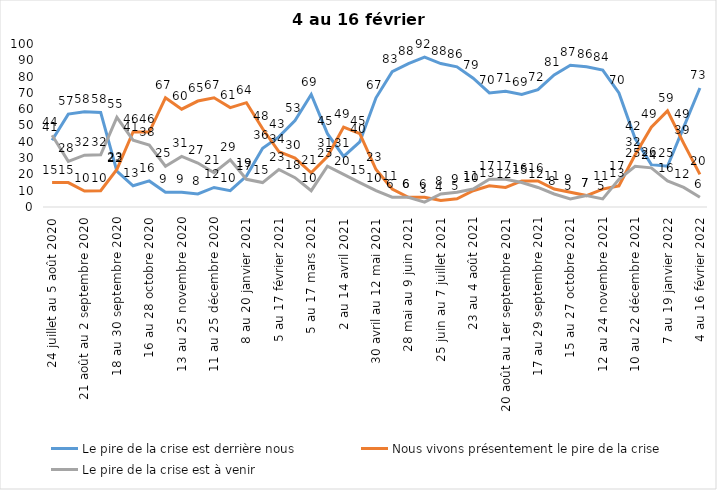
| Category | Le pire de la crise est derrière nous | Nous vivons présentement le pire de la crise | Le pire de la crise est à venir |
|---|---|---|---|
| 24 juillet au 5 août 2020 | 41 | 15 | 44 |
| 7 au 19 août 2020 | 57 | 15 | 28 |
| 21 août au 2 septembre 2020 | 58.39 | 9.84 | 31.77 |
| 4 au 16 septembre 2020 | 58 | 10 | 32 |
| 18 au 30 septembre 2020 | 22 | 23 | 55 |
| 2 au 14 octobre 2020 | 13 | 46 | 41 |
| 16 au 28 octobre 2020 | 16 | 46 | 38 |
| 30 octobre au 11 novembre 2020 | 9 | 67 | 25 |
| 13 au 25 novembre 2020 | 9 | 60 | 31 |
| 27 novembre au 9 décembre 2020 | 8 | 65 | 27 |
| 11 au 25 décembre 2020 | 12 | 67 | 21 |
| 25 décembre 2020 au 6 janvier 2021 | 10 | 61 | 29 |
| 8 au 20 janvier 2021 | 19 | 64 | 17 |
| 22 janvier au 3 février 2021 | 36 | 48 | 15 |
| 5 au 17 février 2021 | 43 | 34 | 23 |
| 19 février au 3 mars 2021 | 53 | 30 | 18 |
| 5 au 17 mars 2021 | 69 | 21 | 10 |
| 19 au 31 mars 2021 | 45 | 31 | 25 |
| 2 au 14 avril 2021 | 31 | 49 | 20 |
| 16 au 28 avril 2021 | 40 | 45 | 15 |
| 30 avril au 12 mai 2021 | 67 | 23 | 10 |
| 14 au 26 mai 2021 | 83 | 11 | 6 |
| 28 mai au 9 juin 2021 | 88 | 6 | 6 |
| 11 au 23 juin 2021 | 92 | 6 | 3 |
| 25 juin au 7 juillet 2021 | 88 | 4 | 8 |
| 9 au 21 juillet 2021 | 86 | 5 | 9 |
| 23 au 4 août 2021 | 79 | 10 | 11 |
| 6 au 18 août 2021 | 70 | 13 | 17 |
| 20 août au 1er septembre 2021 | 71 | 12 | 17 |
| 3 au 15 septembre 2021 | 69 | 16 | 15 |
| 17 au 29 septembre 2021 | 72 | 16 | 12 |
| 1 au 13 octobre 2021 | 81 | 11 | 8 |
| 15 au 27 octobre 2021 | 87 | 9 | 5 |
| 29 octobre au 10 novembre 2021 | 86 | 7 | 7 |
| 12 au 24 novembre 2021 | 84 | 11 | 5 |
| 26 novembre au 8 décembre 2021 | 70 | 13 | 17 |
| 10 au 22 décembre 2021 | 42 | 32 | 25 |
| 24 décembre 2021 au 5 janvier 2022 | 26 | 49 | 24 |
| 7 au 19 janvier 2022 | 25 | 59 | 16 |
| 21 janvier au 2 février 2022 | 49 | 39 | 12 |
| 4 au 16 février 2022 | 73 | 20 | 6 |